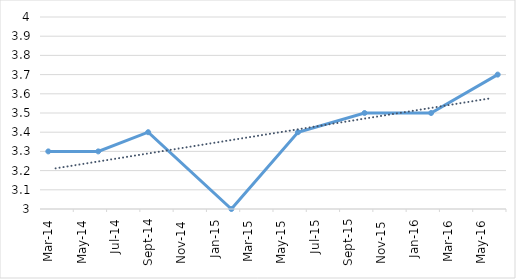
| Category | Series 0 |
|---|---|
| 2014-03-01 | 3.3 |
| 2014-06-01 | 3.3 |
| 2014-09-01 | 3.4 |
| 2015-02-01 | 3 |
| 2015-06-01 | 3.4 |
| 2015-10-01 | 3.5 |
| 2016-02-01 | 3.5 |
| 2016-06-01 | 3.7 |